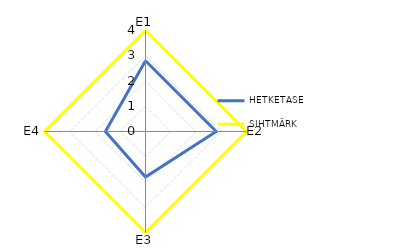
| Category | HETKETASE | SIHTMÄRK |
|---|---|---|
| E1 | 2.8 | 4 |
| E2 | 2.8 | 4 |
| E3 | 1.8 | 4 |
| E4 | 1.588 | 4 |